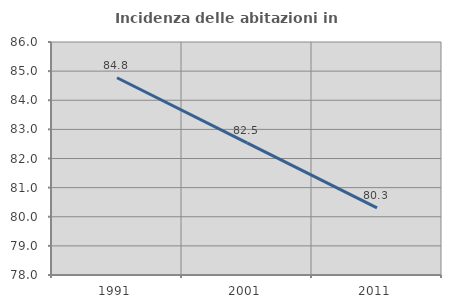
| Category | Incidenza delle abitazioni in proprietà  |
|---|---|
| 1991.0 | 84.774 |
| 2001.0 | 82.535 |
| 2011.0 | 80.302 |